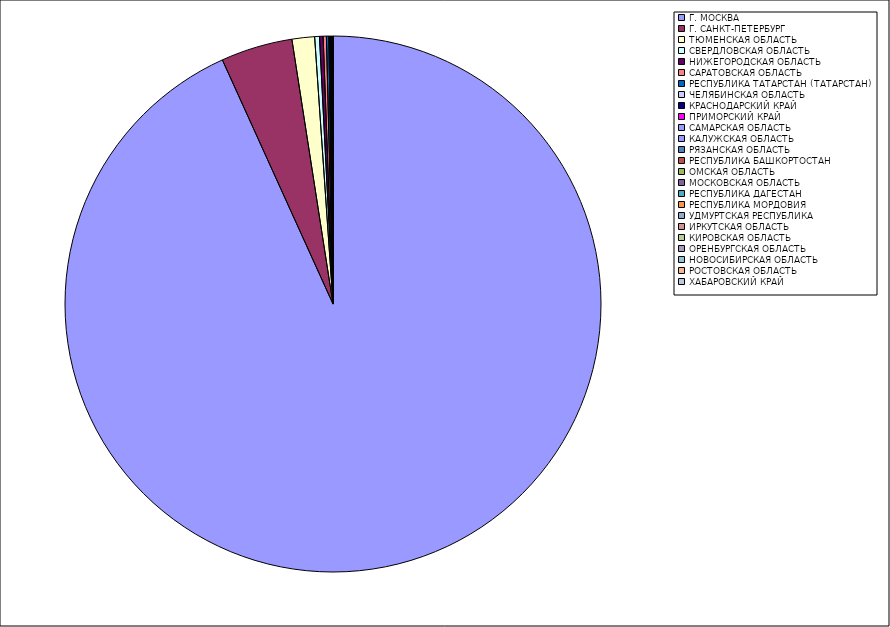
| Category | Оборот |
|---|---|
| Г. МОСКВА | 93.182 |
| Г. САНКТ-ПЕТЕРБУРГ | 4.317 |
| ТЮМЕНСКАЯ ОБЛАСТЬ | 1.359 |
| СВЕРДЛОВСКАЯ ОБЛАСТЬ | 0.288 |
| НИЖЕГОРОДСКАЯ ОБЛАСТЬ | 0.218 |
| САРАТОВСКАЯ ОБЛАСТЬ | 0.194 |
| РЕСПУБЛИКА ТАТАРСТАН (ТАТАРСТАН) | 0.144 |
| ЧЕЛЯБИНСКАЯ ОБЛАСТЬ | 0.031 |
| КРАСНОДАРСКИЙ КРАЙ | 0.03 |
| ПРИМОРСКИЙ КРАЙ | 0.021 |
| САМАРСКАЯ ОБЛАСТЬ | 0.021 |
| КАЛУЖСКАЯ ОБЛАСТЬ | 0.019 |
| РЯЗАНСКАЯ ОБЛАСТЬ | 0.016 |
| РЕСПУБЛИКА БАШКОРТОСТАН | 0.014 |
| ОМСКАЯ ОБЛАСТЬ | 0.013 |
| МОСКОВСКАЯ ОБЛАСТЬ | 0.013 |
| РЕСПУБЛИКА ДАГЕСТАН | 0.012 |
| РЕСПУБЛИКА МОРДОВИЯ | 0.01 |
| УДМУРТСКАЯ РЕСПУБЛИКА | 0.009 |
| ИРКУТСКАЯ ОБЛАСТЬ | 0.007 |
| КИРОВСКАЯ ОБЛАСТЬ | 0.007 |
| ОРЕНБУРГСКАЯ ОБЛАСТЬ | 0.007 |
| НОВОСИБИРСКАЯ ОБЛАСТЬ | 0.006 |
| РОСТОВСКАЯ ОБЛАСТЬ | 0.006 |
| ХАБАРОВСКИЙ КРАЙ | 0.005 |